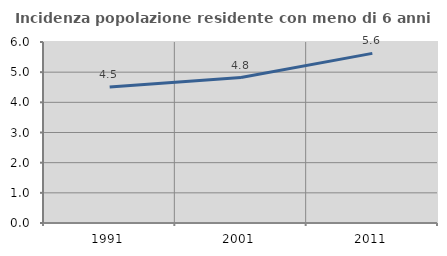
| Category | Incidenza popolazione residente con meno di 6 anni |
|---|---|
| 1991.0 | 4.506 |
| 2001.0 | 4.82 |
| 2011.0 | 5.622 |